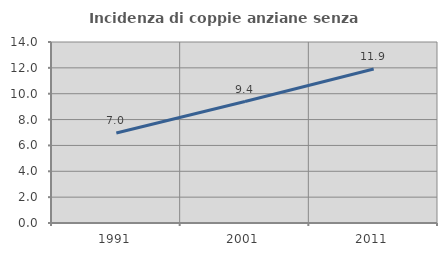
| Category | Incidenza di coppie anziane senza figli  |
|---|---|
| 1991.0 | 6.957 |
| 2001.0 | 9.394 |
| 2011.0 | 11.912 |